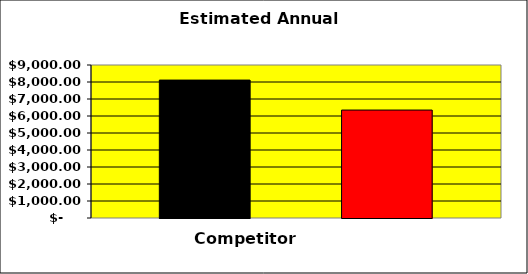
| Category | Series 0 | Series 1 | Series 2 |
|---|---|---|---|
| 0 | 8112.5 |  | 6349.75 |